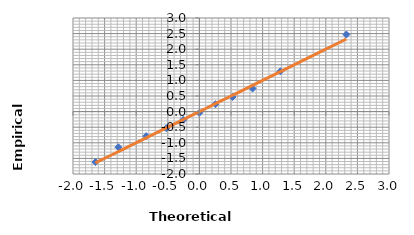
| Category | Series 0 |
|---|---|
| -1.6448536269514726 | -1.618 |
| -1.2815515655446006 | -1.142 |
| -0.8416212335729145 | -0.786 |
| -0.5244005127080409 | -0.533 |
| -0.2533471031357998 | -0.26 |
| 0.0 | -0.038 |
| 0.2533471031357998 | 0.237 |
| 0.5244005127080408 | 0.467 |
| 0.8416212335729147 | 0.738 |
| 1.2815515655446006 | 1.29 |
| 2.3263478740408408 | 2.471 |